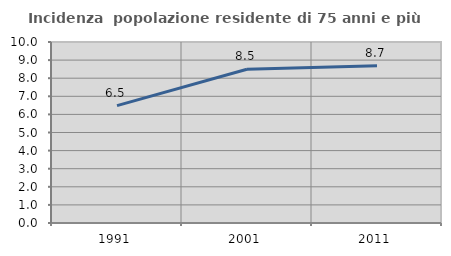
| Category | Incidenza  popolazione residente di 75 anni e più |
|---|---|
| 1991.0 | 6.482 |
| 2001.0 | 8.498 |
| 2011.0 | 8.681 |